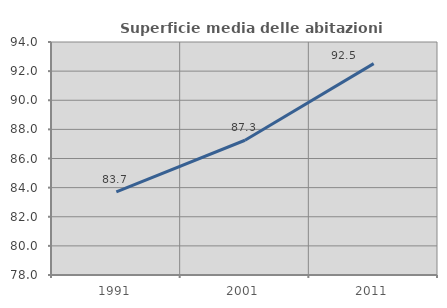
| Category | Superficie media delle abitazioni occupate |
|---|---|
| 1991.0 | 83.712 |
| 2001.0 | 87.252 |
| 2011.0 | 92.513 |